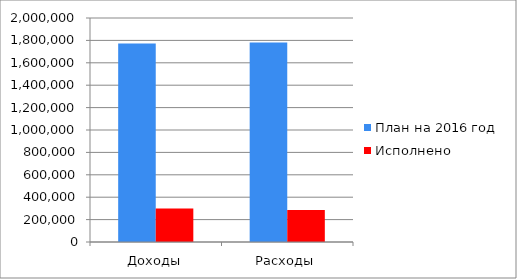
| Category | План на 2016 год | Исполнено  |
|---|---|---|
| Доходы | 1773309 | 299429 |
| Расходы | 1780565 | 285815 |